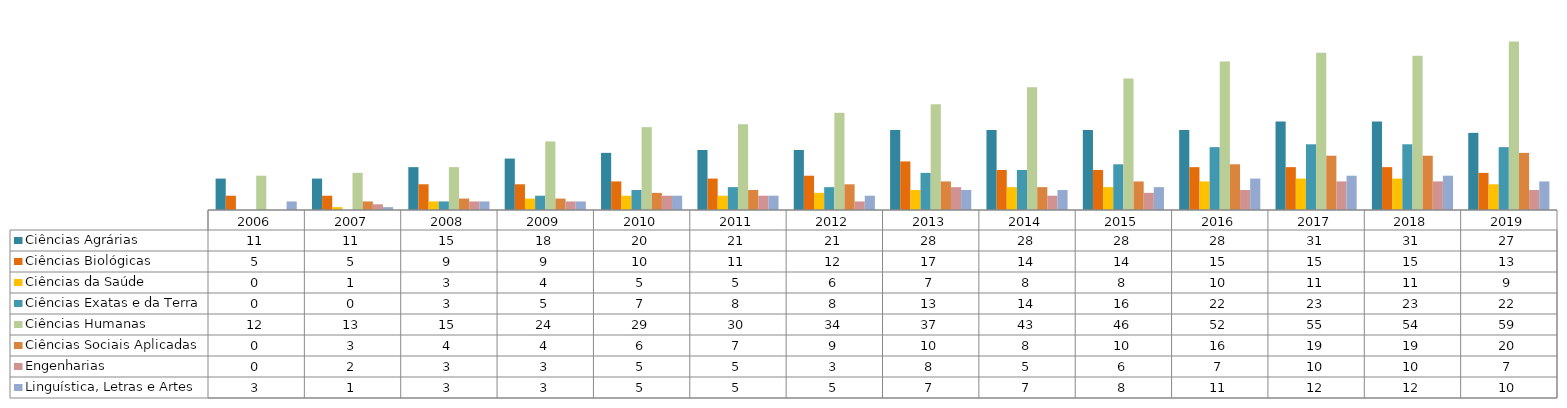
| Category | Ciências Agrárias  | Ciências Biológicas  | Ciências da Saúde  | Ciências Exatas e da Terra  | Ciências Humanas  | Ciências Sociais Aplicadas  | Engenharias  | Linguística, Letras e Artes  |
|---|---|---|---|---|---|---|---|---|
| 2006.0 | 11 | 5 | 0 | 0 | 12 | 0 | 0 | 3 |
| 2007.0 | 11 | 5 | 1 | 0 | 13 | 3 | 2 | 1 |
| 2008.0 | 15 | 9 | 3 | 3 | 15 | 4 | 3 | 3 |
| 2009.0 | 18 | 9 | 4 | 5 | 24 | 4 | 3 | 3 |
| 2010.0 | 20 | 10 | 5 | 7 | 29 | 6 | 5 | 5 |
| 2011.0 | 21 | 11 | 5 | 8 | 30 | 7 | 5 | 5 |
| 2012.0 | 21 | 12 | 6 | 8 | 34 | 9 | 3 | 5 |
| 2013.0 | 28 | 17 | 7 | 13 | 37 | 10 | 8 | 7 |
| 2014.0 | 28 | 14 | 8 | 14 | 43 | 8 | 5 | 7 |
| 2015.0 | 28 | 14 | 8 | 16 | 46 | 10 | 6 | 8 |
| 2016.0 | 28 | 15 | 10 | 22 | 52 | 16 | 7 | 11 |
| 2017.0 | 31 | 15 | 11 | 23 | 55 | 19 | 10 | 12 |
| 2018.0 | 31 | 15 | 11 | 23 | 54 | 19 | 10 | 12 |
| 2019.0 | 27 | 13 | 9 | 22 | 59 | 20 | 7 | 10 |